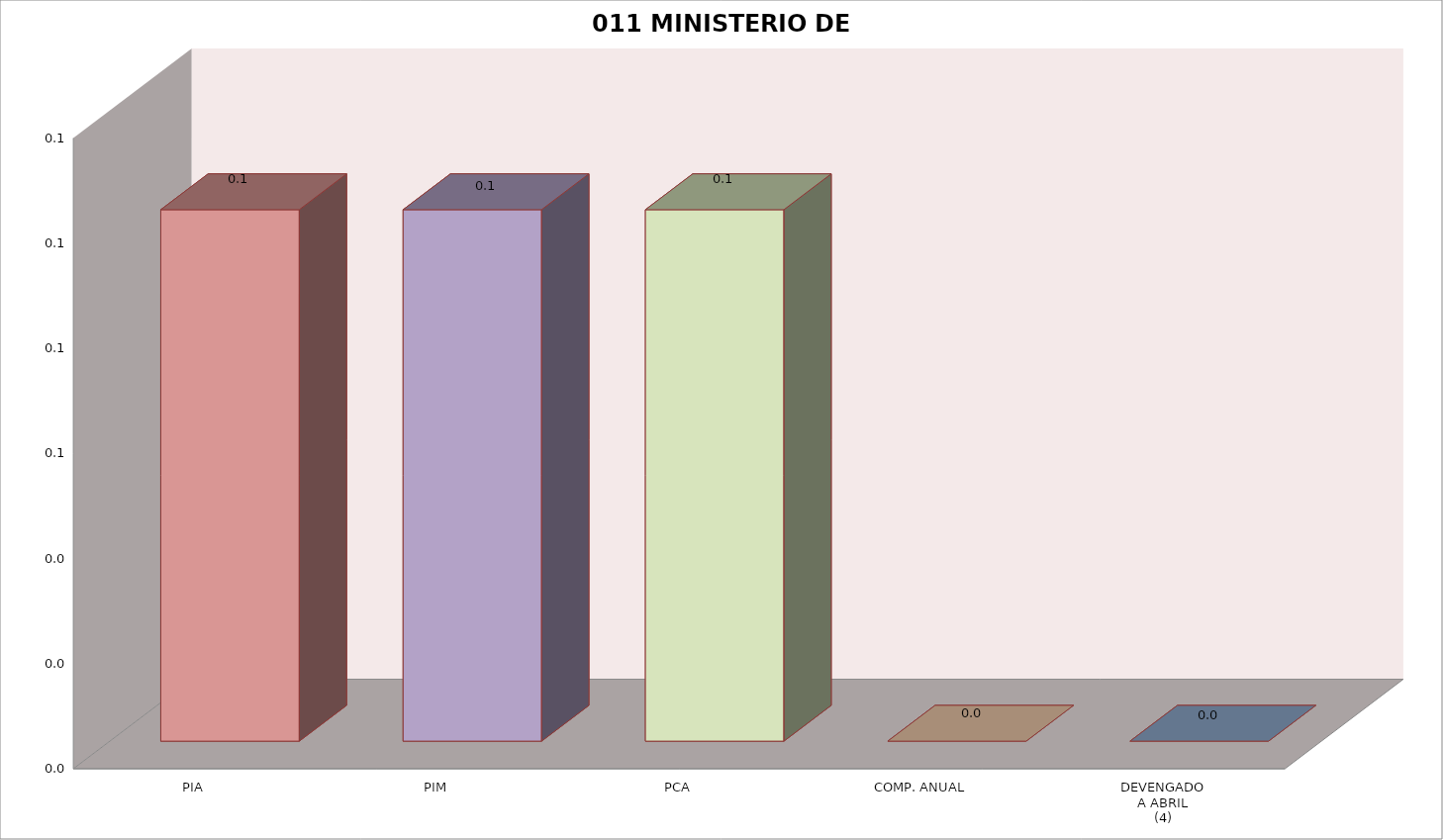
| Category | 011 MINISTERIO DE SALUD |
|---|---|
| PIA | 0.101 |
| PIM | 0.101 |
| PCA | 0.101 |
| COMP. ANUAL | 0 |
| DEVENGADO
A ABRIL
(4) | 0 |